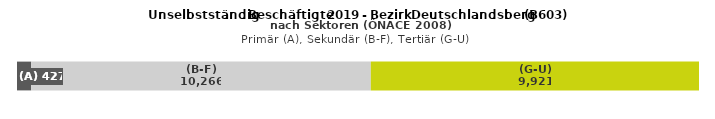
| Category | (A) | (B-F) | (G-U) |
|---|---|---|---|
| 0 | 427 | 10266 | 9921 |